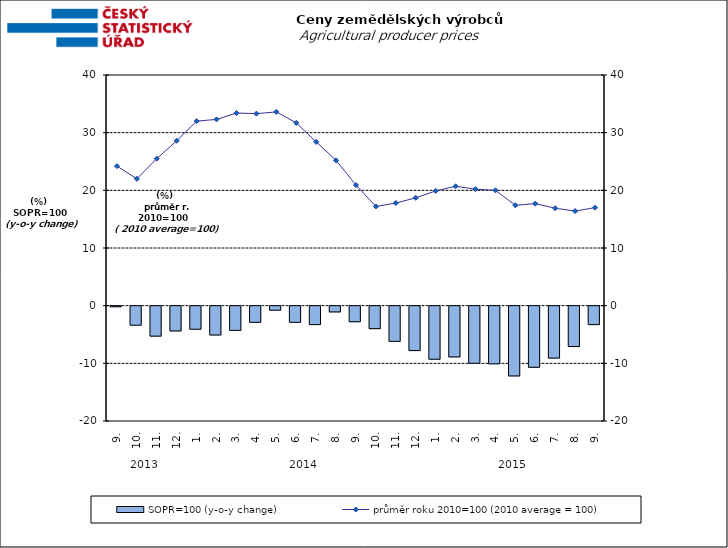
| Category | SOPR=100 (y-o-y change)   |
|---|---|
| 0 | -0.1 |
| 1 | -3.3 |
| 2 | -5.2 |
| 3 | -4.3 |
| 4 | -4 |
| 5 | -5 |
| 6 | -4.2 |
| 7 | -2.8 |
| 8 | -0.7 |
| 9 | -2.8 |
| 10 | -3.2 |
| 11 | -1 |
| 12 | -2.7 |
| 13 | -3.9 |
| 14 | -6.1 |
| 15 | -7.7 |
| 16 | -9.2 |
| 17 | -8.8 |
| 18 | -9.9 |
| 19 | -10 |
| 20 | -12.1 |
| 21 | -10.6 |
| 22 | -9 |
| 23 | -7 |
| 24 | -3.2 |